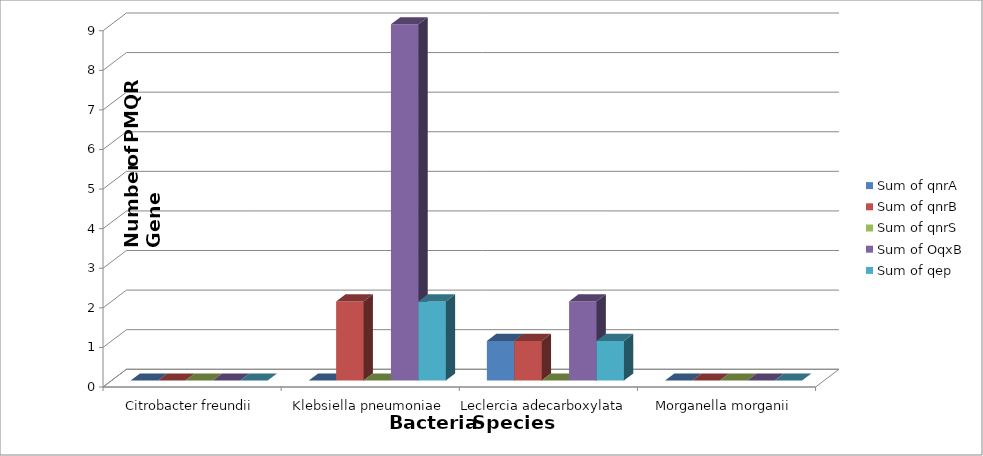
| Category | Sum of qnrA | Sum of qnrB | Sum of qnrS | Sum of OqxB | Sum of qep |
|---|---|---|---|---|---|
| Citrobacter freundii | 0 | 0 | 0 | 0 | 0 |
| Klebsiella pneumoniae | 0 | 2 | 0 | 9 | 2 |
| Leclercia adecarboxylata  | 1 | 1 | 0 | 2 | 1 |
| Morganella morganii | 0 | 0 | 0 | 0 | 0 |